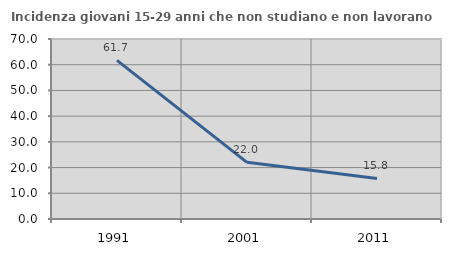
| Category | Incidenza giovani 15-29 anni che non studiano e non lavorano  |
|---|---|
| 1991.0 | 61.709 |
| 2001.0 | 22.034 |
| 2011.0 | 15.789 |